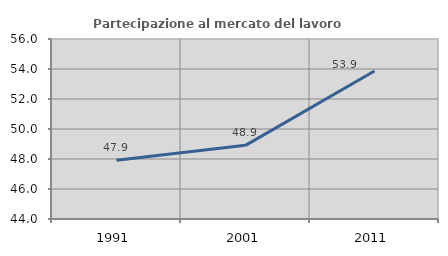
| Category | Partecipazione al mercato del lavoro  femminile |
|---|---|
| 1991.0 | 47.912 |
| 2001.0 | 48.909 |
| 2011.0 | 53.866 |